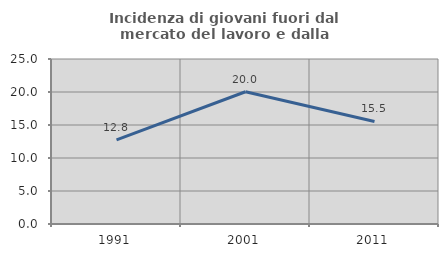
| Category | Incidenza di giovani fuori dal mercato del lavoro e dalla formazione  |
|---|---|
| 1991.0 | 12.758 |
| 2001.0 | 20.038 |
| 2011.0 | 15.542 |